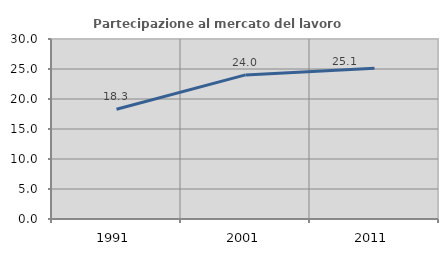
| Category | Partecipazione al mercato del lavoro  femminile |
|---|---|
| 1991.0 | 18.281 |
| 2001.0 | 24.019 |
| 2011.0 | 25.129 |